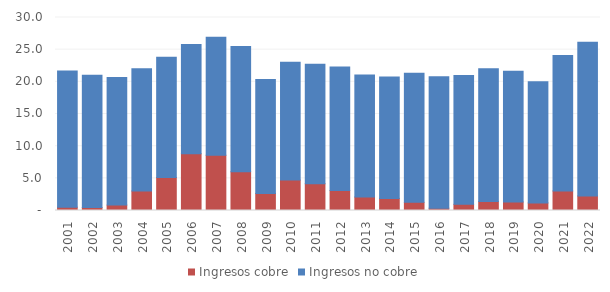
| Category | Ingresos cobre | Ingresos no cobre |
|---|---|---|
| 2001.0 | 0.516 | 21.183 |
| 2002.0 | 0.464 | 20.575 |
| 2003.0 | 0.843 | 19.827 |
| 2004.0 | 3.026 | 19.014 |
| 2005.0 | 5.134 | 18.696 |
| 2006.0 | 8.813 | 16.972 |
| 2007.0 | 8.593 | 18.326 |
| 2008.0 | 6.013 | 19.472 |
| 2009.0 | 2.652 | 17.708 |
| 2010.0 | 4.73 | 18.301 |
| 2011.0 | 4.167 | 18.552 |
| 2012.0 | 3.091 | 19.206 |
| 2013.0 | 2.099 | 18.946 |
| 2014.0 | 1.88 | 18.859 |
| 2015.0 | 1.264 | 20.062 |
| 2016.0 | 0.361 | 20.428 |
| 2017.0 | 0.955 | 20.016 |
| 2018.0 | 1.389 | 20.637 |
| 2019.0 | 1.329 | 20.328 |
| 2020.0 | 1.176 | 18.848 |
| 2021.0 | 3.031 | 21.05 |
| 2022.0 | 2.262 | 23.881 |